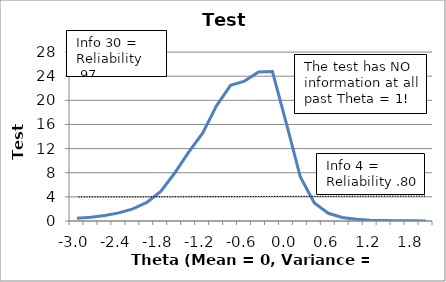
| Category | Test Information |
|---|---|
| -3.0 | 0.449 |
| -2.8 | 0.635 |
| -2.6 | 0.917 |
| -2.4 | 1.349 |
| -2.2 | 2.015 |
| -2.0 | 3.078 |
| -1.8 | 4.908 |
| -1.6 | 7.951 |
| -1.4 | 11.402 |
| -1.2 | 14.557 |
| -1.0 | 19.137 |
| -0.8 | 22.477 |
| -0.6 | 23.185 |
| -0.4 | 24.683 |
| -0.2 | 24.765 |
| 0.0 | 16.157 |
| 0.2 | 7.284 |
| 0.4 | 3 |
| 0.6 | 1.28 |
| 0.8 | 0.58 |
| 1.0 | 0.277 |
| 1.2 | 0.139 |
| 1.4 | 0.072 |
| 1.6 | 0.039 |
| 1.8 | 0.021 |
| 2.0 | 0.012 |